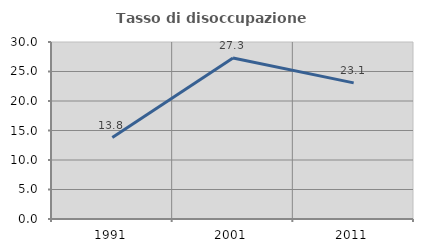
| Category | Tasso di disoccupazione giovanile  |
|---|---|
| 1991.0 | 13.793 |
| 2001.0 | 27.273 |
| 2011.0 | 23.077 |